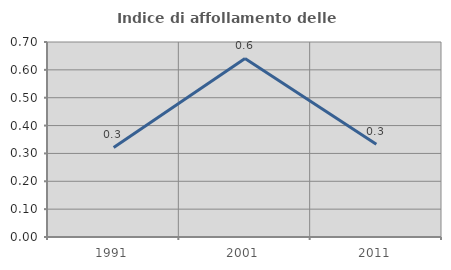
| Category | Indice di affollamento delle abitazioni  |
|---|---|
| 1991.0 | 0.322 |
| 2001.0 | 0.641 |
| 2011.0 | 0.333 |